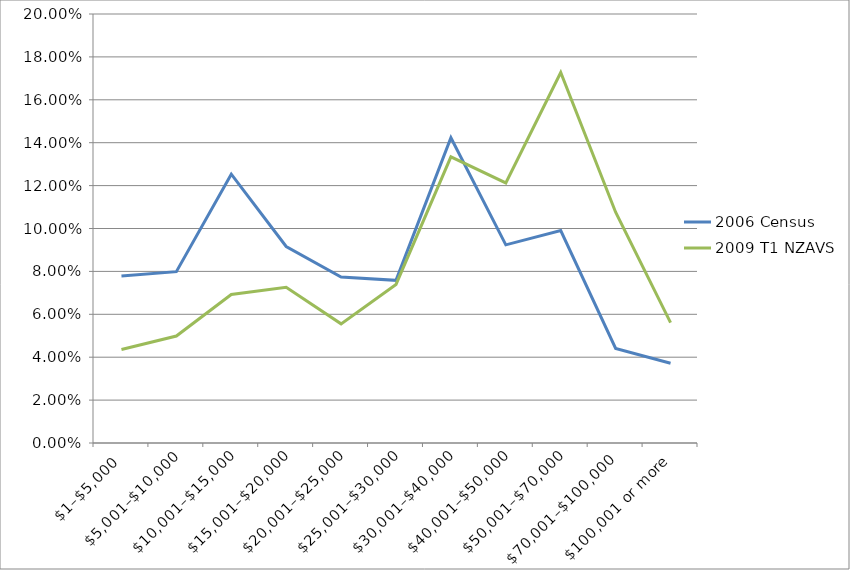
| Category | 2006 Census | 2009 T1 NZAVS |
|---|---|---|
| $1–$5,000 | 0.078 | 0.044 |
| $5,001–$10,000 | 0.08 | 0.05 |
| $10,001–$15,000 | 0.125 | 0.069 |
| $15,001–$20,000 | 0.092 | 0.073 |
| $20,001–$25,000 | 0.077 | 0.056 |
| $25,001–$30,000 | 0.076 | 0.074 |
| $30,001–$40,000 | 0.142 | 0.133 |
| $40,001–$50,000 | 0.092 | 0.121 |
| $50,001–$70,000 | 0.099 | 0.173 |
| $70,001–$100,000 | 0.044 | 0.108 |
| $100,001 or more | 0.037 | 0.056 |